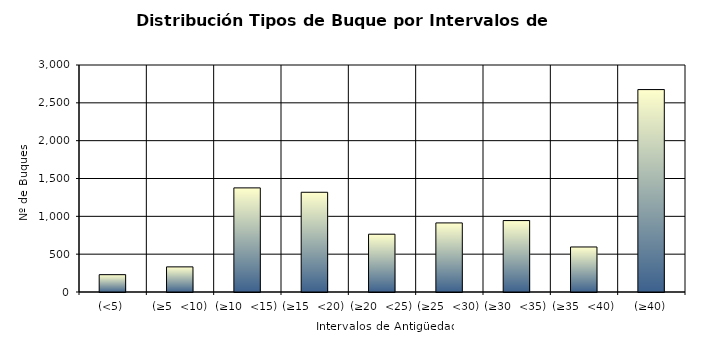
| Category | Series 0 |
|---|---|
| (<5) | 229 |
| (≥5  <10) | 332 |
| (≥10  <15) | 1376 |
| (≥15  <20) | 1318 |
| (≥20  <25) | 764 |
| (≥25  <30) | 913 |
| (≥30  <35) | 944 |
| (≥35  <40) | 595 |
| (≥40) | 2675 |